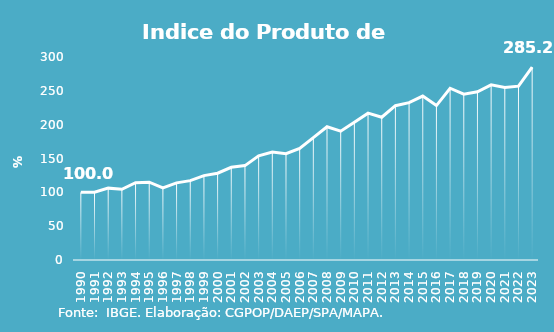
| Category | Indice de Prod. base 1990 |
|---|---|
| 1990.0 | 100 |
| 1991.0 | 100.275 |
| 1992.0 | 106.203 |
| 1993.0 | 104.57 |
| 1994.0 | 114.164 |
| 1995.0 | 115.024 |
| 1996.0 | 106.552 |
| 1997.0 | 114.037 |
| 1998.0 | 117.319 |
| 1999.0 | 124.734 |
| 2000.0 | 128.293 |
| 2001.0 | 136.975 |
| 2002.0 | 139.51 |
| 2003.0 | 153.868 |
| 2004.0 | 159.641 |
| 2005.0 | 157.136 |
| 2006.0 | 164.858 |
| 2007.0 | 180.781 |
| 2008.0 | 196.91 |
| 2009.0 | 190.309 |
| 2010.0 | 203.581 |
| 2011.0 | 217.041 |
| 2012.0 | 210.932 |
| 2013.0 | 228.009 |
| 2014.0 | 232.562 |
| 2015.0 | 242.318 |
| 2016.0 | 228.239 |
| 2017.0 | 253.826 |
| 2018.0 | 245.134 |
| 2019.0 | 248.619 |
| 2020.0 | 258.848 |
| 2021.0 | 254.988 |
| 2022.0 | 256.903 |
| 2023.0 | 285.156 |